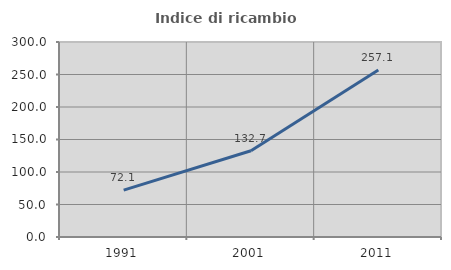
| Category | Indice di ricambio occupazionale  |
|---|---|
| 1991.0 | 72.095 |
| 2001.0 | 132.669 |
| 2011.0 | 257.055 |